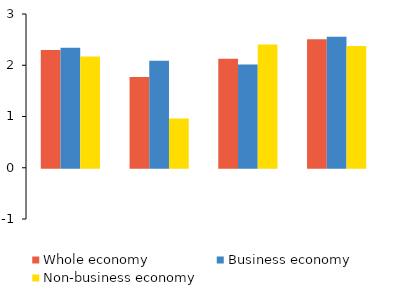
| Category | Whole economy | Business economy | Non-business economy |
|---|---|---|---|
| 1998–2002 | 2.3 | 2.34 | 2.17 |
| 2003–2008 | 1.771 | 2.088 | 0.962 |
| 2009–2014 | 2.129 | 2.017 | 2.404 |
| 2015–2017 | 2.508 | 2.558 | 2.375 |